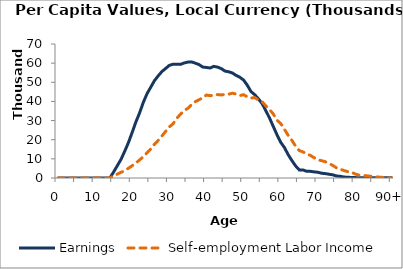
| Category | Earnings | Self-employment Labor Income |
|---|---|---|
| 0 | 0 | 0 |
|  | 0 | 0 |
| 2 | 0 | 0 |
| 3 | 0 | 0 |
| 4 | 0 | 0 |
| 5 | 0 | 0 |
| 6 | 0 | 0 |
| 7 | 0 | 0 |
| 8 | 0 | 0 |
| 9 | 0 | 0 |
| 10 | 0 | 0 |
| 11 | 0 | 0 |
| 12 | 0 | 0 |
| 13 | 0 | 0 |
| 14 | 0 | 76.44 |
| 15 | 3093.148 | 1034.735 |
| 16 | 6404.176 | 1993.03 |
| 17 | 9715.204 | 2951.326 |
| 18 | 13971.631 | 3797.053 |
| 19 | 18492.375 | 5095.613 |
| 20 | 23751.619 | 6410.733 |
| 21 | 29239.613 | 7841.126 |
| 22 | 33991.427 | 9432.791 |
| 23 | 39453.38 | 11085.985 |
| 24 | 44019.094 | 13171.982 |
| 25 | 47394.936 | 15147.435 |
| 26 | 50829.053 | 17608.102 |
| 27 | 53328.488 | 19598.386 |
| 28 | 55575.017 | 21894.829 |
| 29 | 57185.409 | 24318.649 |
| 30 | 58826.791 | 26681.933 |
| 31 | 59426.058 | 28274.199 |
| 32 | 59449.695 | 31210.42 |
| 33 | 59354.282 | 33233.479 |
| 34 | 60085.564 | 35280.82 |
| 35 | 60550.931 | 36365.511 |
| 36 | 60662.227 | 38316.604 |
| 37 | 59987.236 | 39860.234 |
| 38 | 59265.626 | 40872.203 |
| 39 | 57952.416 | 41856.061 |
| 40 | 57743.805 | 43345.029 |
| 41 | 57472.193 | 42996.116 |
| 42 | 58322.111 | 43226.292 |
| 43 | 57927.595 | 43575.064 |
| 44 | 57141.209 | 43393.393 |
| 45 | 55847.296 | 43669.24 |
| 46 | 55485.075 | 43790.172 |
| 47 | 54827.912 | 44275.271 |
| 48 | 53587.205 | 43909.48 |
| 49 | 52622.707 | 43050.795 |
| 50 | 51181.152 | 43521.013 |
| 51 | 48464.535 | 42414.552 |
| 52 | 45162.691 | 41773.019 |
| 53 | 43512.776 | 41988.274 |
| 54 | 41357.854 | 40744.991 |
| 55 | 38827.789 | 39875.407 |
| 56 | 35126.307 | 37674.641 |
| 57 | 31285.665 | 35735.729 |
| 58 | 26927.403 | 33446.976 |
| 59 | 22554.77 | 30201.195 |
| 60 | 18631.307 | 28440.002 |
| 61 | 15918.441 | 25430.71 |
| 62 | 12206.316 | 22318.59 |
| 63 | 9145.314 | 19701.951 |
| 64 | 6312.543 | 16651.239 |
| 65 | 4221.853 | 14335.274 |
| 66 | 4202.683 | 13618.867 |
| 67 | 3505.987 | 12596.822 |
| 68 | 3468.304 | 11794.973 |
| 69 | 3200.394 | 10598.557 |
| 70 | 2996.22 | 9497.623 |
| 71 | 2504.615 | 9051.215 |
| 72 | 2283.356 | 8522.212 |
| 73 | 1968.079 | 7603.872 |
| 74 | 1679.925 | 6582.734 |
| 75 | 1062.58 | 5339.297 |
| 76 | 893.778 | 4661.079 |
| 77 | 530.121 | 3891 |
| 78 | 361.538 | 3365.728 |
| 79 | 298.377 | 3074.466 |
| 80 | 214.407 | 2149.575 |
| 81 | 100.588 | 1515.415 |
| 82 | 95.49 | 1379.168 |
| 83 | 99.998 | 1180.932 |
| 84 | 80.005 | 972.042 |
| 85 | 77.747 | 745.772 |
| 86 | 69.141 | 529.633 |
| 87 | 82.465 | 381.306 |
| 88 | 95.788 | 232.979 |
| 89 | 109.111 | 84.652 |
| 90+ | 122.435 | 0 |